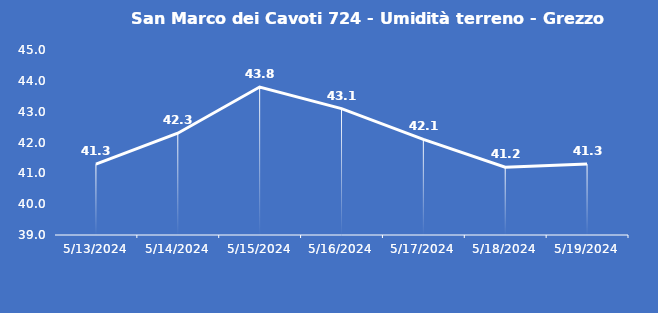
| Category | San Marco dei Cavoti 724 - Umidità terreno - Grezzo (%VWC) |
|---|---|
| 5/13/24 | 41.3 |
| 5/14/24 | 42.3 |
| 5/15/24 | 43.8 |
| 5/16/24 | 43.1 |
| 5/17/24 | 42.1 |
| 5/18/24 | 41.2 |
| 5/19/24 | 41.3 |